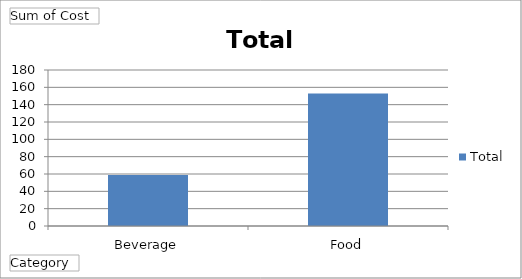
| Category | Total |
|---|---|
| Beverage | 58.95 |
| Food | 152.99 |